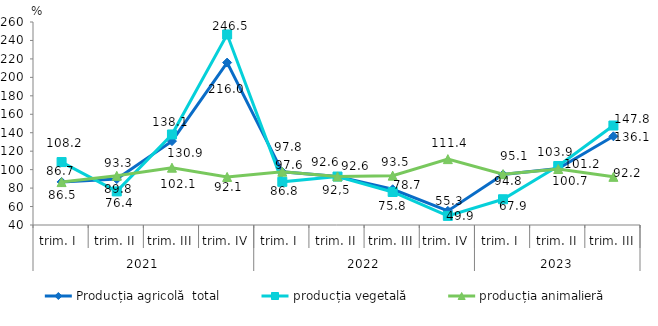
| Category | Producția agricolă  total | producția vegetală | producția animalieră |
|---|---|---|---|
| 0 | 86.7 | 108.2 | 86.5 |
| 1 | 89.8 | 76.4 | 93.3 |
| 2 | 130.9 | 138.1 | 102.1 |
| 3 | 216 | 246.5 | 92.1 |
| 4 | 97.6 | 86.8 | 97.8 |
| 5 | 92.6 | 92.5 | 92.6 |
| 6 | 78.7 | 75.8 | 93.5 |
| 7 | 55.3 | 49.9 | 111.4 |
| 8 | 94.8 | 67.9 | 95.1 |
| 9 | 101.2 | 103.9 | 100.7 |
| 10 | 136.1 | 147.8 | 92.2 |